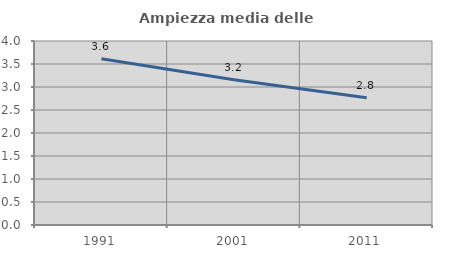
| Category | Ampiezza media delle famiglie |
|---|---|
| 1991.0 | 3.614 |
| 2001.0 | 3.16 |
| 2011.0 | 2.768 |